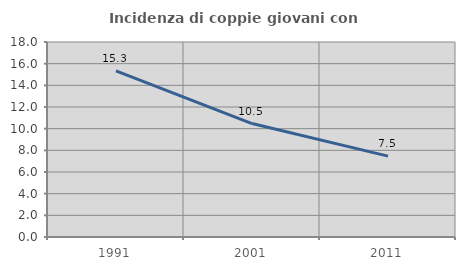
| Category | Incidenza di coppie giovani con figli |
|---|---|
| 1991.0 | 15.342 |
| 2001.0 | 10.473 |
| 2011.0 | 7.463 |